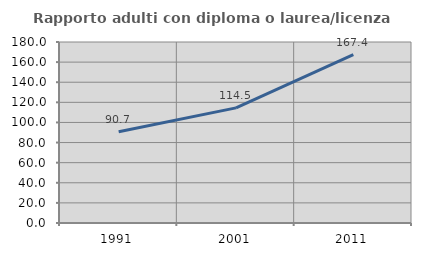
| Category | Rapporto adulti con diploma o laurea/licenza media  |
|---|---|
| 1991.0 | 90.714 |
| 2001.0 | 114.483 |
| 2011.0 | 167.407 |